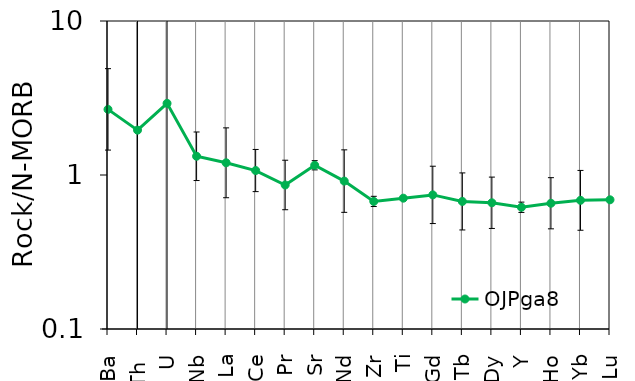
| Category | OJPga8 |
|---|---|
| Ba | 2.668 |
| Th  | 1.955 |
| U | 2.919 |
| Nb | 1.323 |
| La | 1.2 |
| Ce | 1.069 |
| Pr | 0.861 |
| Sr | 1.157 |
| Nd | 0.913 |
| Zr | 0.674 |
| Ti | 0.707 |
| Gd | 0.743 |
| Tb | 0.673 |
| Dy | 0.66 |
| Y | 0.617 |
| Ho | 0.655 |
| Yb | 0.685 |
| Lu | 0.69 |